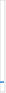
| Category | Caso | Resuelta | Pendiente |
|---|---|---|---|
| Quejas | 0 | 0 | 0 |
| Reclamaciones  | 1 | 1 | 0 |
| Sugerencias | 0 | 0 | 0 |
| Otras | 0 | 0 | 0 |
| Total | 0 | 0 | 0 |